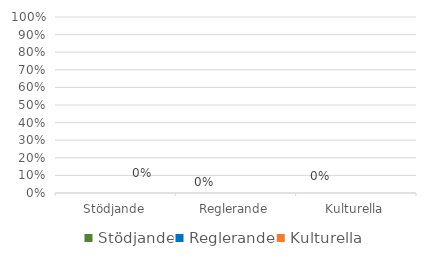
| Category | Series 1 |
|---|---|
| Stödjande | 0 |
| Reglerande | 0 |
| Kulturella | 0 |